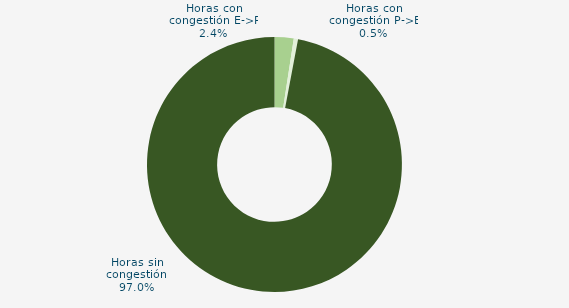
| Category | Horas con congestión E->P |
|---|---|
| Horas con congestión E->P | 2.419 |
| Horas con congestión P->E | 0.538 |
| Horas sin congestión | 97.043 |